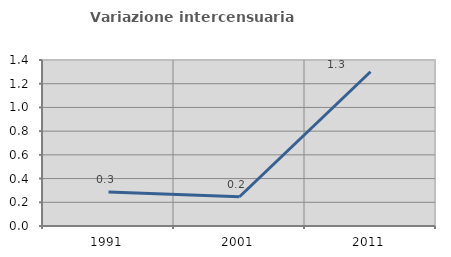
| Category | Variazione intercensuaria annua |
|---|---|
| 1991.0 | 0.287 |
| 2001.0 | 0.247 |
| 2011.0 | 1.301 |